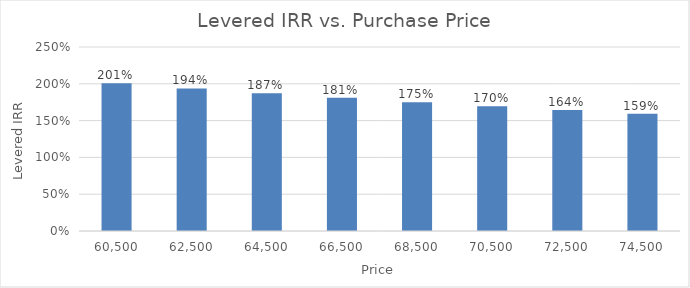
| Category | 16% |
|---|---|
| 60500.0 | 2.008 |
| 62500.0 | 1.938 |
| 64500.0 | 1.871 |
| 66500.0 | 1.809 |
| 68500.0 | 1.751 |
| 70500.0 | 1.695 |
| 72500.0 | 1.643 |
| 74500.0 | 1.594 |